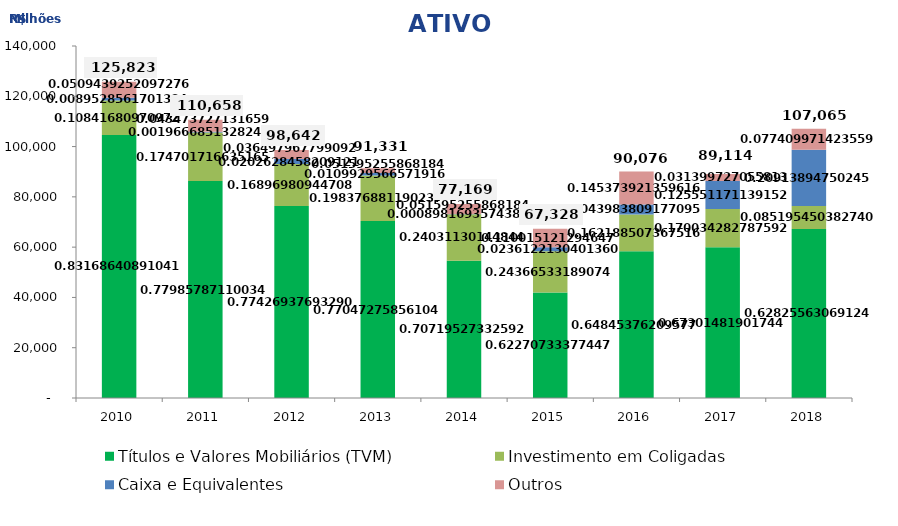
| Category | Títulos e Valores Mobiliários (TVM) | Investimento em Coligadas | Caixa e Equivalentes  | Outros  |
|---|---|---|---|---|
| 2010.0 | 104645.63 | 13641.374 | 1126.479 | 6409.939 |
| 2011.0 | 86297.733 | 19332.192 | 217.63 | 4810.728 |
| 2012.0 | 76375.723 | 16667.573 | 1998.774 | 3600.244 |
| 2013.0 | 70368.207 | 18118 | 1004 | 1841 |
| 2014.0 | 54573.685 | 18544.628 | 69.311 | 3981.564 |
| 2015.0 | 41925.763 | 16405.548 | 1589.768 | 7407.12 |
| 2016.0 | 58409.924 | 14609.243 | 3961.872 | 13094.657 |
| 2017.0 | 59975.261 | 15152.49 | 11188.408 | 2798.165 |
| 2018.0 | 67264.121 | 9121.442 | 22391.439 | 8287.89 |